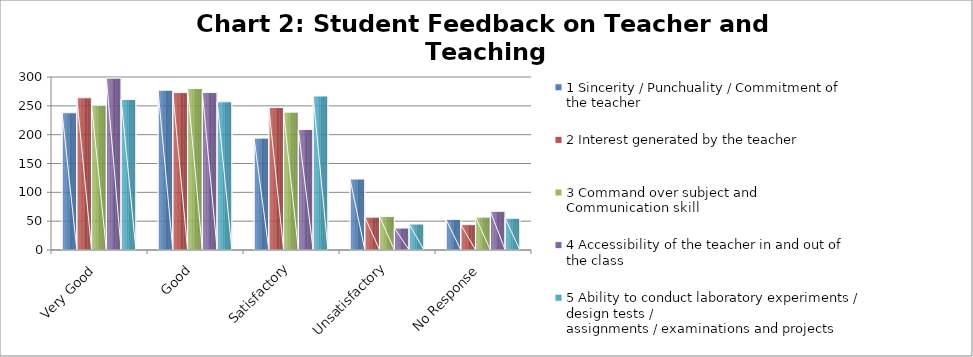
| Category | 1 Sincerity / Punchuality / Commitment of the teacher | 2 Interest generated by the teacher | 3 Command over subject and Communication skill | 4 Accessibility of the teacher in and out of the class | 5 Ability to conduct laboratory experiments / design tests /
assignments / examinations and projects |
|---|---|---|---|---|---|
| Very Good | 238 | 264 | 251 | 298 | 261 |
| Good | 277 | 273 | 280 | 273 | 257 |
| Satisfactory | 194 | 247 | 239 | 209 | 267 |
| Unsatisfactory | 123 | 57 | 58 | 38 | 45 |
| No Response | 53 | 44 | 57 | 67 | 55 |